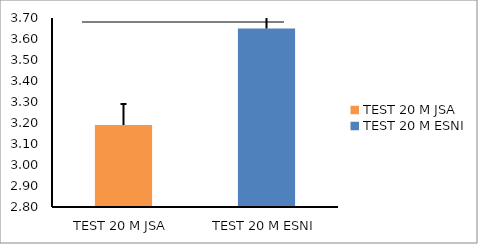
| Category | Series 0 |
|---|---|
| TEST 20 M JSA | 3.191 |
| TEST 20 M ESNI | 3.65 |